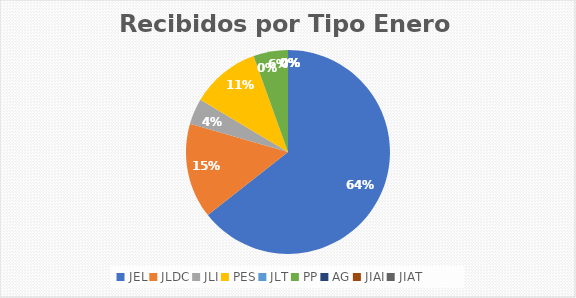
| Category | Series 0 |
|---|---|
| JEL | 47 |
| JLDC | 11 |
| JLI | 3 |
| PES | 8 |
| JLT | 0 |
| PP | 4 |
| AG | 0 |
| JIAI | 0 |
| JIAT | 0 |